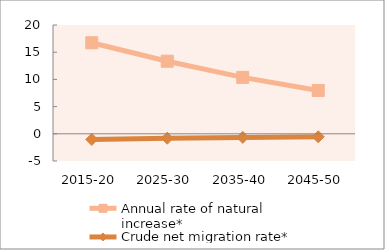
| Category | Annual rate of natural increase* | Crude net migration rate* |
|---|---|---|
| 2015-20 | 16.731 | -1.038 |
| 2025-30 | 13.34 | -0.814 |
| 2035-40 | 10.372 | -0.658 |
| 2045-50 | 7.963 | -0.545 |